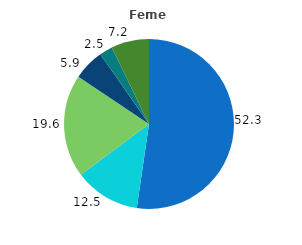
| Category | Series 0 |
|---|---|
| 0 | 52.3 |
| 1 | 12.5 |
| 2 | 19.6 |
| 3 | 5.9 |
| 4 | 2.5 |
| 5 | 7.2 |